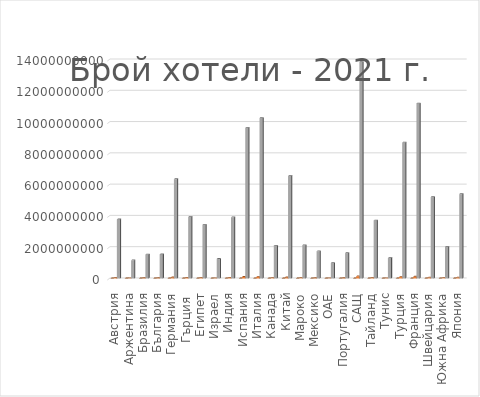
| Category | Сума от Хотели | Сума от Посещения | Сума от Приходи |
|---|---|---|---|
| Австрия | 47638 | 37706300 | 3770630000 |
| Аржентина | 36795 | 11545000 | 1154500000 |
| Бразилия | 53684 | 15275080 | 1527508000 |
| България | 18596 | 15339485 | 1533948500 |
| Германия | 91107 | 63485870 | 6348587000 |
| Гърция  | 48458 | 39369657 | 3936965700 |
| Египет | 39392 | 34317221 | 3431722100 |
| Израел | 23113 | 12456443 | 1245644300 |
| Индия | 63944 | 39036585 | 3903658500 |
| Испания | 95998 | 96307260 | 9630726000 |
| Италия | 105208 | 102560265 | 10256026500 |
| Канада | 26670 | 20917625 | 2091762500 |
| Китай | 125623 | 65567161 | 6556716100 |
| Мароко | 27828 | 21208129 | 2120812900 |
| Мексико | 40214 | 17329243 | 1732924300 |
| ОАЕ | 10114 | 9869301 | 986930100 |
| Португалия | 31465 | 16220576 | 1622057600 |
| САЩ | 174016 | 138383119 | 13838311900 |
| Тайланд | 40707 | 37030982 | 3703098200 |
| Тунис | 15448 | 13136579 | 1313657900 |
| Турция | 78406 | 86871406 | 8687140600 |
| Франция | 103456 | 111871939 | 11187193900 |
| Швейцария | 50413 | 52034379 | 5203437900 |
| Южна Африка | 28547 | 20226663 | 2022666300 |
| Япония | 50797 | 53921885 | 5392188500 |